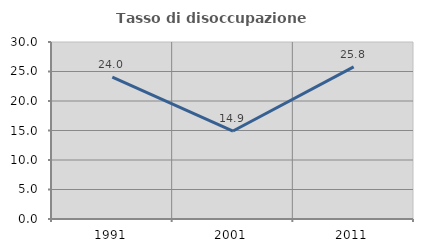
| Category | Tasso di disoccupazione giovanile  |
|---|---|
| 1991.0 | 24.049 |
| 2001.0 | 14.91 |
| 2011.0 | 25.779 |